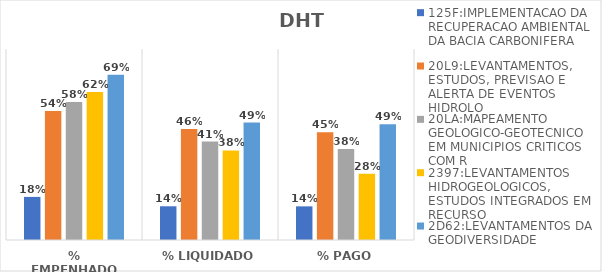
| Category | 125F:IMPLEMENTACAO DA RECUPERACAO AMBIENTAL DA BACIA CARBONIFERA | 20L9:LEVANTAMENTOS, ESTUDOS, PREVISAO E ALERTA DE EVENTOS HIDROLO | 20LA:MAPEAMENTO GEOLOGICO-GEOTECNICO EM MUNICIPIOS CRITICOS COM R | 2397:LEVANTAMENTOS HIDROGEOLOGICOS, ESTUDOS INTEGRADOS EM RECURSO | 2D62:LEVANTAMENTOS DA GEODIVERSIDADE |
|---|---|---|---|---|---|
| % EMPENHADO | 0.18 | 0.54 | 0.578 | 0.62 | 0.692 |
| % LIQUIDADO | 0.141 | 0.465 | 0.412 | 0.375 | 0.492 |
| % PAGO | 0.141 | 0.451 | 0.381 | 0.278 | 0.485 |